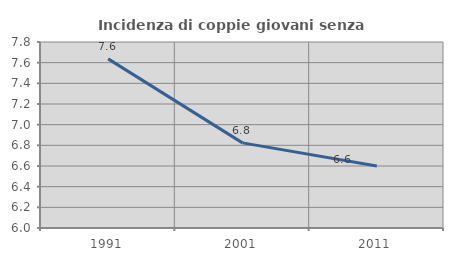
| Category | Incidenza di coppie giovani senza figli |
|---|---|
| 1991.0 | 7.637 |
| 2001.0 | 6.824 |
| 2011.0 | 6.6 |